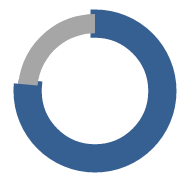
| Category | Series 0 |
|---|---|
| 0 | 0.765 |
| 1 | 0.235 |